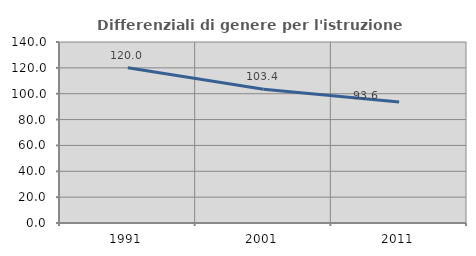
| Category | Differenziali di genere per l'istruzione superiore |
|---|---|
| 1991.0 | 120.046 |
| 2001.0 | 103.426 |
| 2011.0 | 93.583 |